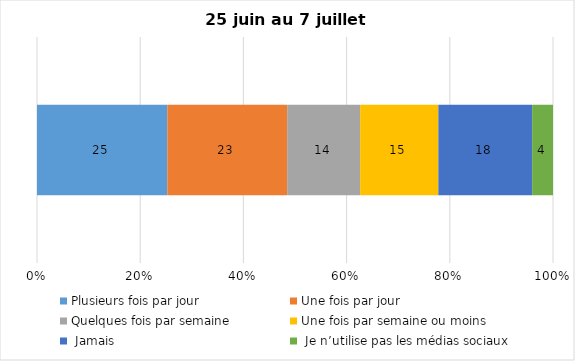
| Category | Plusieurs fois par jour | Une fois par jour | Quelques fois par semaine   | Une fois par semaine ou moins   |  Jamais   |  Je n’utilise pas les médias sociaux |
|---|---|---|---|---|---|---|
| 0 | 25 | 23 | 14 | 15 | 18 | 4 |